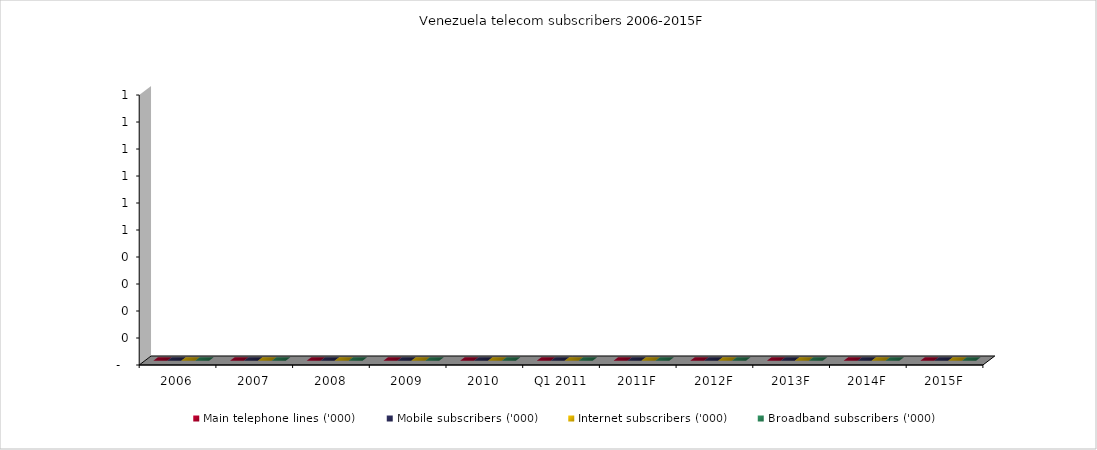
| Category | Main telephone lines ('000) | Mobile subscribers ('000) | Internet subscribers ('000) | Broadband subscribers ('000) |
|---|---|---|---|---|
| 2006 | 0 | 0 | 0 | 0 |
| 2007 | 0 | 0 | 0 | 0 |
| 2008 | 0 | 0 | 0 | 0 |
| 2009 | 0 | 0 | 0 | 0 |
| 2010 | 0 | 0 | 0 | 0 |
| Q1 2011 | 0 | 0 | 0 | 0 |
| 2011F | 0 | 0 | 0 | 0 |
| 2012F | 0 | 0 | 0 | 0 |
| 2013F | 0 | 0 | 0 | 0 |
| 2014F | 0 | 0 | 0 | 0 |
| 2015F | 0 | 0 | 0 | 0 |